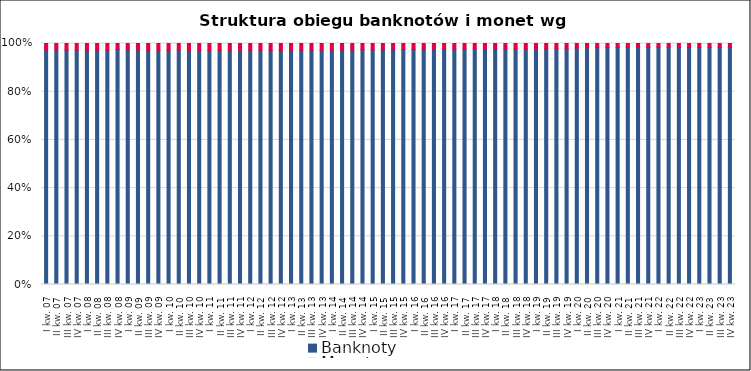
| Category | Banknoty | Monety |
|---|---|---|
| I kw. 07 | 73727.412 | 2040.135 |
| II kw. 07 | 77371.496 | 2137.582 |
| III kw. 07 | 79578.46 | 2225.277 |
| IV kw. 07 | 83364.627 | 2307.653 |
| I kw. 08 | 82715.869 | 2358.844 |
| II kw. 08 | 87199.402 | 2435.251 |
| III kw. 08 | 88168.923 | 2486.825 |
| IV kw. 08 | 99237.803 | 2536.169 |
| I kw. 09 | 97049.999 | 2571.081 |
| II kw. 09 | 98632.739 | 2665.517 |
| III kw. 09 | 95957.726 | 2757.134 |
| IV kw. 09 | 97177.286 | 2776.82 |
| I kw. 10 | 94691.834 | 2724.082 |
| II kw. 10 | 99506.937 | 2768.915 |
| III kw. 10 | 97875.247 | 2839.031 |
| IV kw. 10 | 99764.765 | 2898.294 |
| I kw. 11 | 98447.013 | 2886.718 |
| II kw. 11 | 102183.647 | 2953.775 |
| III kw. 11 | 106395.997 | 3010.322 |
| IV kw. 11 | 108786.226 | 3059.067 |
| I kw. 12 | 105926.984 | 3068.322 |
| II kw. 12 | 110104.057 | 3142.797 |
| III kw. 12 | 109280.313 | 3206.567 |
| IV kw. 12 | 110164.58 | 3250.066 |
| I kw. 13 | 112501.146 | 3253.57 |
| II kw. 13 | 118768.814 | 3307.219 |
| III kw. 13 | 119650.391 | 3384.616 |
| IV kw. 13 | 122428.908 | 3454.923 |
| I kw. 14 | 122838.325 | 3474.731 |
| II kw. 14 | 127576.392 | 3574.954 |
| III kw. 14 | 131462.988 | 3655.159 |
| IV kw. 14 | 138932.525 | 3728.511 |
| I kw. 15 | 139935.731 | 3764.541 |
| II kw. 15 | 146051.815 | 3849.431 |
| III kw. 15 | 150682.665 | 3938.638 |
| IV kw. 15 | 158921.701 | 4030.184 |
| I kw. 16 | 161560.488 | 4078.052 |
| II kw. 16 | 170939.931 | 4172.119 |
| III kw. 16 | 173127.582 | 4249.831 |
| IV kw. 16 | 182975.206 | 4319.775 |
| I kw. 17 | 180684.736 | 4325.239 |
| II kw. 17 | 185147.552 | 4351.953 |
| III kw. 17 | 188987.001 | 4407.459 |
| IV kw. 17 | 193950.164 | 4479.309 |
| I kw. 18 | 194392.161 | 4516.342 |
| II kw. 18 | 202788.928 | 4627.08 |
| III kw. 18 | 206843.682 | 4711.715 |
| IV kw. 18 | 214402.966 | 4795.229 |
| I kw. 19 | 216181.618 | 4813.784 |
| II kw. 19 | 222897.543 | 4944.402 |
| III kw. 19 | 228417.354 | 5025.968 |
| IV kw. 19 | 233356.103 | 5123.396 |
| I kw. 20 | 263939.009 | 5154.408 |
| II kw. 20 | 291310.398 | 5258.381 |
| III kw. 20 | 299058.294 | 5360.578 |
| IV kw. 20 | 316044.445 | 5451.705 |
| I kw. 21 | 327277.158 | 5495.332 |
| II kw. 21 | 336894.667 | 5596.566 |
| III kw. 21 | 342223.08 | 5696.757 |
| IV kw. 21 | 349462.845 | 5781.241 |
| I kw. 22 | 383596.043 | 5816.66 |
| II kw. 22 | 373112.805 | 5908.216 |
| III kw. 22 | 367312.99 | 6005.546 |
| IV kw. 22 | 362212.591 | 6076.251 |
| I kw. 23 | 357418.456 | 6100.123 |
| II kw. 23 | 361621.055 | 6204.148 |
| III kw. 23 | 370372.24 | 6297.562 |
| IV kw. 23 | 370808.245 | 6383.734 |